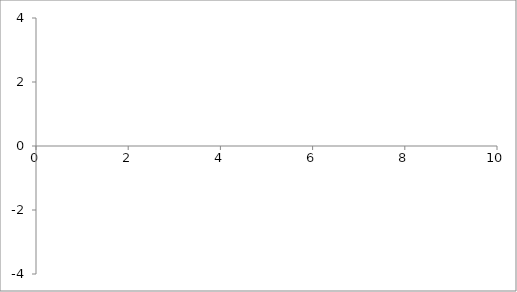
| Category | #¿NOMBRE? |
|---|---|
| 0.0 | 0 |
| 0.0 | 0 |
| 0.0 | 0 |
| 0.0 | 0 |
| 0.0 | 0 |
| 0.0 | 0 |
| 0.0 | 0 |
| 0.0 | 0 |
| 0.0 | 0 |
| 0.0 | 0 |
| 0.0 | 0 |
| 0.0 | 0 |
| 0.0 | 0 |
| 0.0 | 0 |
| 0.0 | 0 |
| 0.0 | 0 |
| 0.0 | 0 |
| 0.0 | 0 |
| 0.0 | 0 |
| 0.0 | 0 |
| 0.0 | 0 |
| 0.0 | 0 |
| 0.0 | 0 |
| 0.0 | 0 |
| 0.0 | 0 |
| 0.0 | 0 |
| 0.0 | 0 |
| 0.0 | 0 |
| 0.0 | 0 |
| 0.0 | 0 |
| 0.0 | 0 |
| 0.0 | 0 |
| 0.0 | 0 |
| 0.0 | 0 |
| 0.0 | 0 |
| 0.0 | 0 |
| 0.0 | 0 |
| 0.0 | 0 |
| 0.0 | 0 |
| 0.0 | 0 |
| 0.0 | 0 |
| 0.0 | 0 |
| 0.0 | 0 |
| 0.0 | 0 |
| 0.0 | 0 |
| 0.0 | 0 |
| 0.0 | 0 |
| 0.0 | 0 |
| 0.0 | 0 |
| 0.0 | 0 |
| 0.0 | 0 |
| 0.0 | 0 |
| 0.0 | 0 |
| 0.0 | 0 |
| 0.0 | 0 |
| 0.0 | 0 |
| 0.0 | 0 |
| 0.0 | 0 |
| 0.0 | 0 |
| 0.0 | 0 |
| 0.0 | 0 |
| 0.0 | 0 |
| 0.0 | 0 |
| 0.0 | 0 |
| 0.0 | 0 |
| 0.0 | 0 |
| 0.0 | 0 |
| 0.0 | 0 |
| 0.0 | 0 |
| 0.0 | 0 |
| 0.0 | 0 |
| 0.0 | 0 |
| 0.0 | 0 |
| 0.0 | 0 |
| 0.0 | 0 |
| 0.0 | 0 |
| 0.0 | 0 |
| 0.0 | 0 |
| 0.0 | 0 |
| 0.0 | 0 |
| 0.0 | 0 |
| 0.0 | 0 |
| 0.0 | 0 |
| 0.0 | 0 |
| 0.0 | 0 |
| 0.0 | 0 |
| 0.0 | 0 |
| 0.0 | 0 |
| 0.0 | 0 |
| 0.0 | 0 |
| 0.0 | 0 |
| 0.0 | 0 |
| 0.0 | 0 |
| 0.0 | 0 |
| 0.0 | 0 |
| 0.0 | 0 |
| 0.0 | 0 |
| 0.0 | 0 |
| 0.0 | 0 |
| 0.0 | 0 |